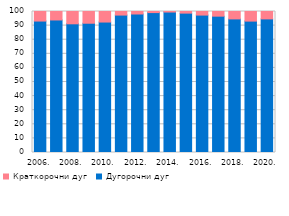
| Category | Дугорочни дуг | Краткорочни дуг |
|---|---|---|
| 2006. | 93.225 | 6.775 |
| 2007. | 93.994 | 6.006 |
| 2008. | 91.269 | 8.731 |
| 2009. | 91.683 | 8.317 |
| 2010. | 92.524 | 7.476 |
| 2011. | 97.465 | 2.535 |
| 2012. | 98.226 | 1.774 |
| 2013. | 99.234 | 0.766 |
| 2014. | 99.616 | 0.384 |
| 2015. | 98.846 | 1.154 |
| 2016. | 97.463 | 2.537 |
| 2017. | 96.693 | 3.307 |
| 2018. | 94.744 | 5.256 |
| 2019. | 93.187 | 6.813 |
| 2020. | 94.755 | 5.245 |